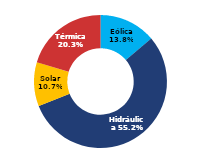
| Category | Sur |
|---|---|
| Eólica | 71.074 |
| Hidráulica | 283.746 |
| Solar | 55.064 |
| Térmica | 104.506 |